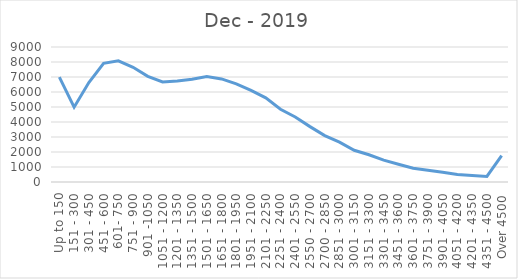
| Category | Dec - 2019 |
|---|---|
| Up to 150 | 6989 |
| 151 - 300 | 4987 |
| 301 - 450 | 6631 |
| 451 - 600 | 7909 |
| 601- 750 | 8077 |
| 751 - 900 | 7645 |
| 901 -1050 | 7048 |
| 1051 - 1200 | 6669 |
| 1201 - 1350 | 6728 |
| 1351 - 1500 | 6845 |
| 1501 - 1650 | 7035 |
| 1651 - 1800 | 6872 |
| 1801 - 1950 | 6547 |
| 1951 - 2100 | 6104 |
| 2101 - 2250 | 5610 |
| 2251 - 2400 | 4853 |
| 2401 - 2550 | 4336 |
| 2550 - 2700 | 3692 |
| 2700 - 2850 | 3093 |
| 2851 - 3000 | 2657 |
| 3001 - 3150 | 2116 |
| 3151 - 3300 | 1818 |
| 3301 - 3450 | 1462 |
| 3451 - 3600 | 1185 |
| 3601 - 3750 | 921 |
| 3751 - 3900 | 788 |
| 3901 - 4050 | 656 |
| 4051 - 4200 | 498 |
| 4201 - 4350 | 437 |
| 4351 - 4500 | 372 |
| Over 4500 | 1765 |